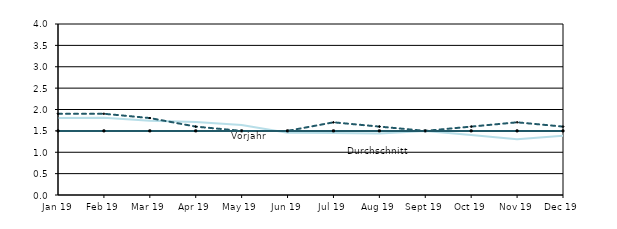
| Category | Berichtsjahr | Durchschnitt | Vorjahr |
|---|---|---|---|
| 2019-01-01 | 1.802 | 1.5 | 1.9 |
| 2019-02-01 | 1.807 | 1.5 | 1.9 |
| 2019-03-01 | 1.738 | 1.5 | 1.8 |
| 2019-04-01 | 1.708 | 1.5 | 1.6 |
| 2019-05-01 | 1.638 | 1.5 | 1.5 |
| 2019-06-01 | 1.458 | 1.5 | 1.5 |
| 2019-07-01 | 1.448 | 1.5 | 1.7 |
| 2019-08-01 | 1.438 | 1.5 | 1.6 |
| 2019-09-01 | 1.498 | 1.5 | 1.5 |
| 2019-10-01 | 1.403 | 1.5 | 1.6 |
| 2019-11-01 | 1.303 | 1.5 | 1.7 |
| 2019-12-01 | 1.389 | 1.5 | 1.6 |